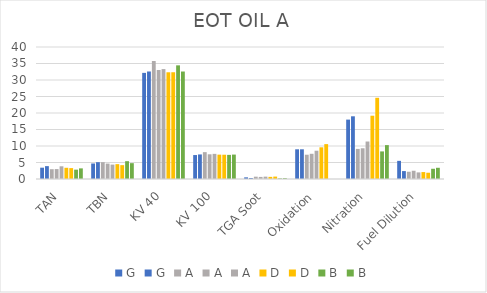
| Category | G | A | D | B |
|---|---|---|---|---|
| TAN | 3.9 | 3.85 | 3.3 | 3.22 |
| TBN | 5.1 | 4.36 | 4.2 | 4.8 |
| KV 40 | 32.58 | 33.305 | 32.35 | 32.57 |
| KV 100 | 7.44 | 7.617 | 7.359 | 7.4 |
| TGA Soot | 0.3 | 0.713 | 0.732 | 0.24 |
| Oxidation | 9 | 8.57 | 10.57 | 0 |
| Nitration | 19 | 11.36 | 24.61 | 10.27 |
| Fuel Dilution | 2.4 | 2 | 1.9 | 3.4 |